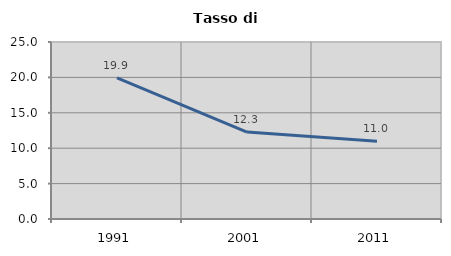
| Category | Tasso di disoccupazione   |
|---|---|
| 1991.0 | 19.933 |
| 2001.0 | 12.287 |
| 2011.0 | 10.994 |